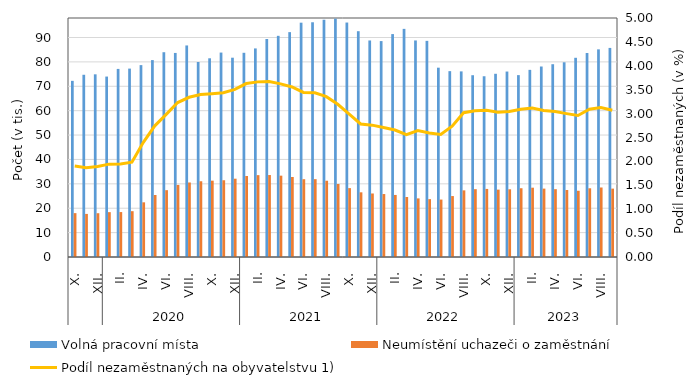
| Category | Volná pracovní místa | Neumístění uchazeči o zaměstnání |
|---|---|---|
| 0 | 72231 | 17985 |
| 1 | 74722 | 17666 |
| 2 | 74905 | 17955 |
| 3 | 73987 | 18390 |
| 4 | 77123 | 18423 |
| 5 | 77251 | 18788 |
| 6 | 78679 | 22421 |
| 7 | 80742 | 25424 |
| 8 | 83969 | 27405 |
| 9 | 83672 | 29567 |
| 10 | 86744 | 30556 |
| 11 | 79961 | 31056 |
| 12 | 81479 | 31302 |
| 13 | 83826 | 31473 |
| 14 | 81719 | 32107 |
| 15 | 83735 | 33217 |
| 16 | 85524 | 33565 |
| 17 | 89385 | 33612 |
| 18 | 90690 | 33352 |
| 19 | 92204 | 32808 |
| 20 | 96081 | 31905 |
| 21 | 96249 | 31917 |
| 22 | 97288 | 31271 |
| 23 | 97734 | 29926 |
| 24 | 96137 | 28242 |
| 25 | 92587 | 26521 |
| 26 | 88785 | 26047 |
| 27 | 88536 | 25817 |
| 28 | 91403 | 25444 |
| 29 | 93541 | 24612 |
| 30 | 88791 | 24028 |
| 31 | 88625 | 23728 |
| 32 | 77627 | 23550 |
| 33 | 76207 | 24989 |
| 34 | 76110 | 27326 |
| 35 | 74541 | 27809 |
| 36 | 74117 | 27914 |
| 37 | 75125 | 27625 |
| 38 | 76045 | 27766 |
| 39 | 74577 | 28199 |
| 40 | 76736 | 28419 |
| 41 | 78112 | 28041 |
| 42 | 79054 | 27810 |
| 43 | 79846 | 27469 |
| 44 | 81683 | 27164 |
| 45 | 83644 | 28176 |
| 46 | 85142 | 28501 |
| 47 | 85733 | 28039 |